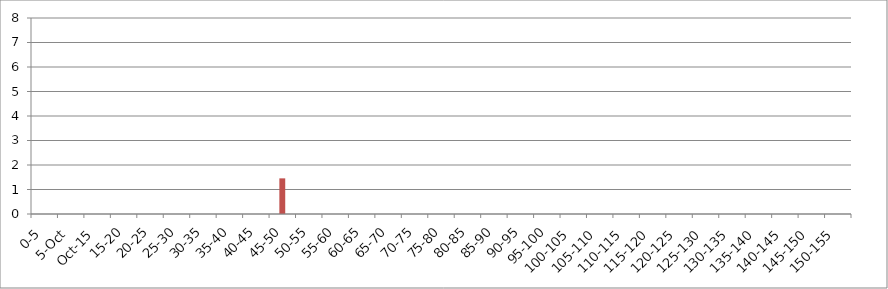
| Category | 119875 | 146067 | 241240 |
|---|---|---|---|
| 0-5 | 0 | 0 | 0 |
| 5.Oct | 0 | 0 | 0 |
| Oct.15 | 0 | 0 | 0 |
| 15-20 | 0 | 0 | 0 |
| 20-25 | 0 | 0 | 0 |
| 25-30 | 0 | 0 | 0 |
| 30-35 | 0 | 0 | 0 |
| 35-40 | 0 | 0 | 0 |
| 40-45 | 0 | 0 | 0 |
| 45-50 | 0 | 1.455 | 0 |
| 50-55 | 0 | 0 | 0 |
| 55-60 | 0 | 0 | 0 |
| 60-65 | 0 | 0 | 0 |
| 65-70 | 0 | 0 | 0 |
| 70-75 | 0 | 0 | 0 |
| 75-80 | 0 | 0 | 0 |
| 80-85 | 0 | 0 | 0 |
| 85-90 | 0 | 0 | 0 |
| 90-95 | 0 | 0 | 0 |
| 95-100 | 0 | 0 | 0 |
| 100-105 | 0 | 0 | 0 |
| 105-110 | 0 | 0 | 0 |
| 110-115 | 0 | 0 | 0 |
| 115-120 | 0 | 0 | 0 |
| 120-125 | 0 | 0 | 0 |
| 125-130 | 0 | 0 | 0 |
| 130-135 | 0 | 0 | 0 |
| 135-140 | 0 | 0 | 0 |
| 140-145 | 0 | 0 | 0 |
| 145-150 | 0 | 0 | 0 |
| 150-155 | 0 | 0 | 0 |